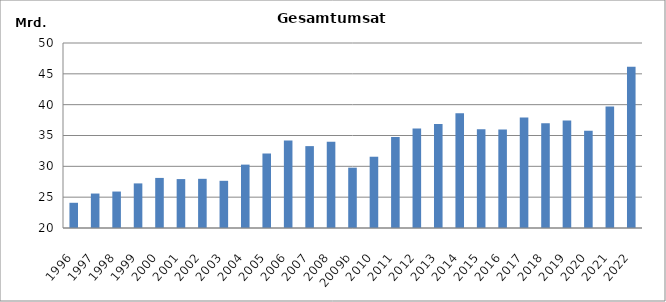
| Category | Series 0 |
|---|---|
| 1996 | 24088396 |
| 1997 | 25588482 |
| 1998 | 25911875 |
| 1999 | 27231996 |
| 2000 | 28121089 |
| 2001 | 27932719 |
| 2002 | 27976228 |
| 2003 | 27652647 |
| 2004 | 30278000 |
| 2005 | 32080721 |
| 2006 | 34189922 |
| 2007 | 33278221 |
| 2008 | 33993013 |
| 2009b | 29783049 |
| 2010 | 31557474.731 |
| 2011 | 34741088 |
| 2012 | 36149532 |
| 2013 | 36865320 |
| 2014 | 38623232.674 |
| 2015 | 36018872 |
| 2016 | 35975244 |
| 2017 | 37901736 |
| 2018 | 36997819 |
| 2019 | 37418803 |
| 2020 | 35788469 |
| 2021 | 39715028.881 |
| 2022 | 46152740.504 |